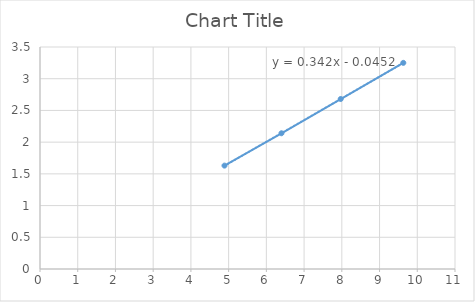
| Category | Series 0 |
|---|---|
| 4.89 | 1.63 |
| 6.4 | 2.14 |
| 7.97 | 2.68 |
| 9.63 | 3.25 |